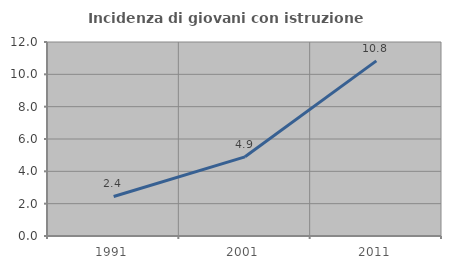
| Category | Incidenza di giovani con istruzione universitaria |
|---|---|
| 1991.0 | 2.447 |
| 2001.0 | 4.898 |
| 2011.0 | 10.833 |